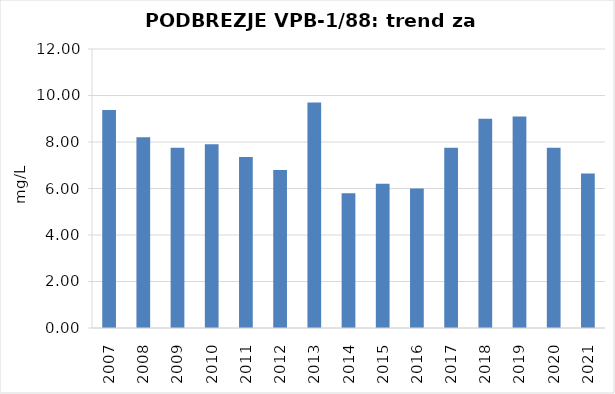
| Category | Vsota |
|---|---|
| 2007 | 9.375 |
| 2008 | 8.2 |
| 2009 | 7.75 |
| 2010 | 7.9 |
| 2011 | 7.35 |
| 2012 | 6.8 |
| 2013 | 9.7 |
| 2014 | 5.8 |
| 2015 | 6.2 |
| 2016 | 6 |
| 2017 | 7.75 |
| 2018 | 9 |
| 2019 | 9.1 |
| 2020 | 7.75 |
| 2021 | 6.65 |